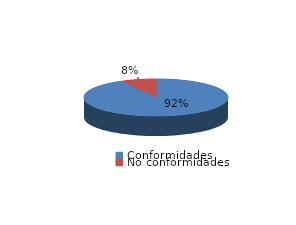
| Category | Series 0 |
|---|---|
| Conformidades | 1069 |
| No conformidades | 91 |